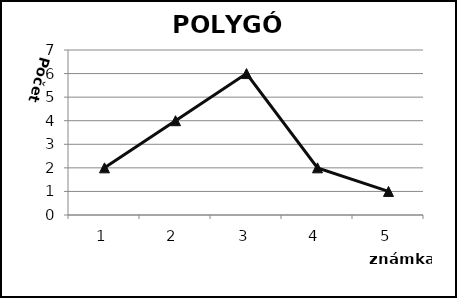
| Category | Počet žiakov |
|---|---|
| 1.0 | 2 |
| 2.0 | 4 |
| 3.0 | 6 |
| 4.0 | 2 |
| 5.0 | 1 |